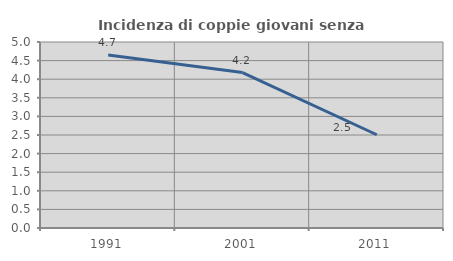
| Category | Incidenza di coppie giovani senza figli |
|---|---|
| 1991.0 | 4.652 |
| 2001.0 | 4.178 |
| 2011.0 | 2.507 |